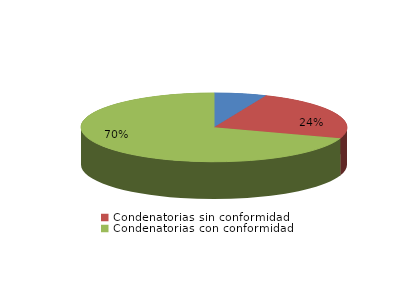
| Category | Series 0 |
|---|---|
| Absolutorias | 19 |
| Condenatorias sin conformidad | 71 |
| Condenatorias con conformidad | 209 |